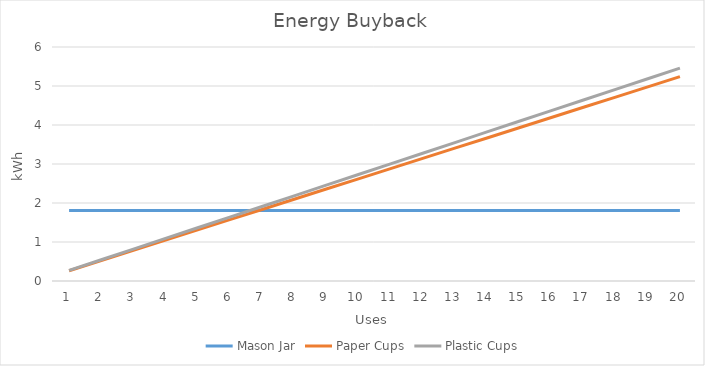
| Category | Mason Jar | Paper Cups | Plastic Cups |
|---|---|---|---|
| 0 | 1.81 | 0.262 | 0.273 |
| 1 | 1.81 | 0.524 | 0.546 |
| 2 | 1.81 | 0.786 | 0.819 |
| 3 | 1.81 | 1.048 | 1.092 |
| 4 | 1.81 | 1.31 | 1.365 |
| 5 | 1.81 | 1.572 | 1.638 |
| 6 | 1.81 | 1.834 | 1.911 |
| 7 | 1.81 | 2.096 | 2.184 |
| 8 | 1.81 | 2.358 | 2.457 |
| 9 | 1.81 | 2.62 | 2.73 |
| 10 | 1.81 | 2.882 | 3.003 |
| 11 | 1.81 | 3.144 | 3.276 |
| 12 | 1.81 | 3.406 | 3.549 |
| 13 | 1.81 | 3.668 | 3.822 |
| 14 | 1.81 | 3.93 | 4.095 |
| 15 | 1.81 | 4.192 | 4.368 |
| 16 | 1.81 | 4.454 | 4.641 |
| 17 | 1.81 | 4.716 | 4.914 |
| 18 | 1.81 | 4.978 | 5.187 |
| 19 | 1.81 | 5.24 | 5.46 |